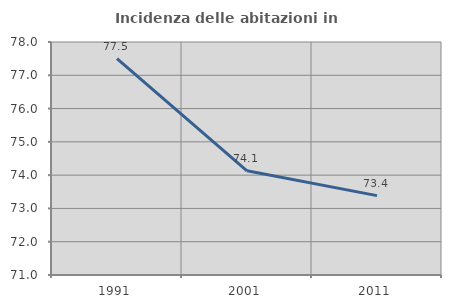
| Category | Incidenza delle abitazioni in proprietà  |
|---|---|
| 1991.0 | 77.5 |
| 2001.0 | 74.129 |
| 2011.0 | 73.384 |